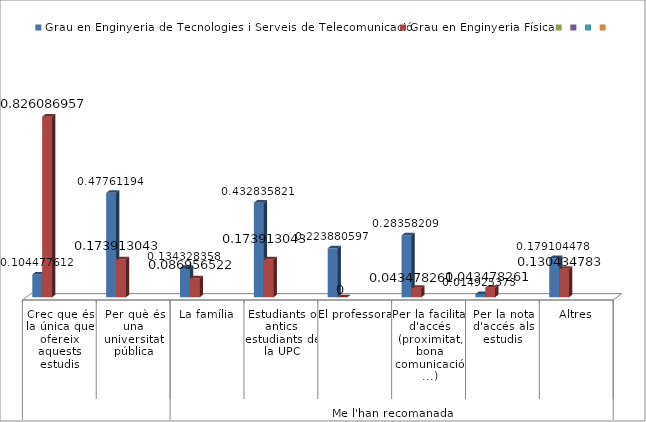
| Category | Grau en Enginyeria de Tecnologies i Serveis de Telecomunicació | Grau en Enginyeria Física | Series 2 | Series 3 | Series 4 | Series 5 |
|---|---|---|---|---|---|---|
| 0 | 0.104 | 0.826 |  |  |  |  |
| 1 | 0.478 | 0.174 |  |  |  |  |
| 2 | 0.134 | 0.087 |  |  |  |  |
| 3 | 0.433 | 0.174 |  |  |  |  |
| 4 | 0.224 | 0 |  |  |  |  |
| 5 | 0.284 | 0.043 |  |  |  |  |
| 6 | 0.015 | 0.043 |  |  |  |  |
| 7 | 0.179 | 0.13 |  |  |  |  |